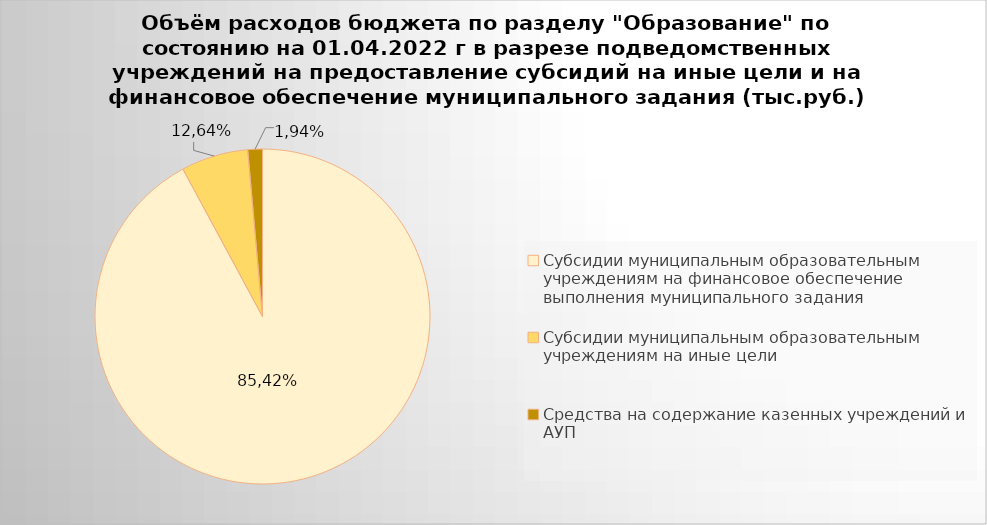
| Category | Series 0 |
|---|---|
| Субсидии муниципальным образовательным учреждениям на финансовое обеспечение выполнения муниципального задания | 7033379.8 |
| Субсидии муниципальным образовательным учреждениям на иные цели | 493895.21 |
| Средства на содержание казенных учреждений и АУП | 107627.23 |